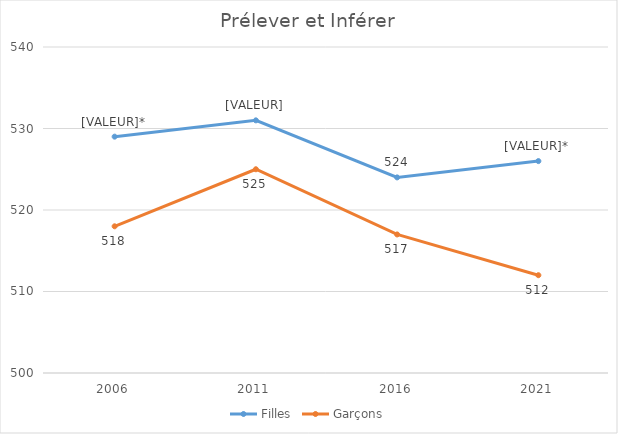
| Category | Filles | Garçons |
|---|---|---|
| 2006.0 | 529 | 518 |
| 2011.0 | 531 | 525 |
| 2016.0 | 524 | 517 |
| 2021.0 | 526 | 512 |